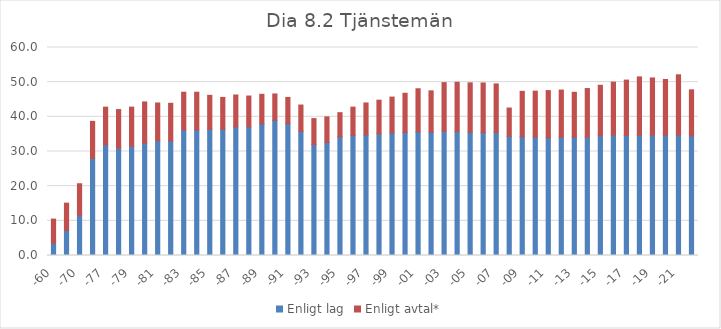
| Category | Enligt lag | Enligt avtal* |
|---|---|---|
| -60 | 3.5 | 7 |
| -65 | 7.2 | 7.9 |
| -70 | 11.6 | 9.1 |
| -76 | 28 | 10.7 |
| -77 | 31.9 | 10.9 |
| -78 | 31 | 11.1 |
| -79 | 31.5 | 11.3 |
| -80 | 32.4 | 11.9 |
| -81 | 33.1 | 10.9 |
| -82 | 33 | 10.9 |
| -83 | 36.2 | 10.9 |
| -84 | 36.2 | 10.9 |
| -85 | 36.4 | 9.8 |
| -86 | 36.4 | 9.2 |
| -87 | 37.1 | 9.2 |
| -88 | 37.1 | 8.9 |
| -89 | 38 | 8.5 |
| -90 | 39 | 7.6 |
| -91 | 38 | 7.6 |
| -92 | 35.8 | 7.6 |
| -93 | 32 | 7.5 |
| -94 | 32.6 | 7.4 |
| -95 | 34.2 | 7 |
| -96 | 34.6 | 8.2 |
| -97 | 34.8 | 9.2 |
| -98 | 35.1 | 9.7 |
| -99 | 35.4 | 10.3 |
| -00 | 35.5 | 11.3 |
| -01 | 35.7 | 12.4 |
| -02 | 35.6 | 11.9 |
| -03 | 35.82 | 14.05 |
| -04 | 35.73 | 14.24 |
| -05 | 35.59 | 14.21 |
| -06 | 35.43 | 14.34 |
| -07 | 35.45 | 14.04 |
| -08 | 34.36 | 8.18 |
| -09 | 34.25 | 13.1 |
| -10 | 34.17 | 13.23 |
| -11 | 33.92 | 13.65 |
| -12 | 34.12 | 13.61 |
| -13 | 34.12 | 12.96 |
| -14 | 34.12 | 14.04 |
| -15 | 34.52 | 14.58 |
| -16 | 34.72 | 15.3 |
| -17 | 34.62 | 15.98 |
| -18 | 34.72 | 16.8 |
| -19 | 34.7 | 16.52 |
| -20 | 34.72 | 16.06 |
| -21 | 34.72 | 17.41 |
| -22 | 34.52 | 13.27 |